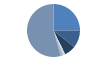
| Category | Series 0 |
|---|---|
| ARRASTRE | 372 |
| CERCO | 159 |
| PALANGRE | 103 |
| REDES DE ENMALLE | 18 |
| ARTES FIJAS | 24 |
| ARTES MENORES | 807 |